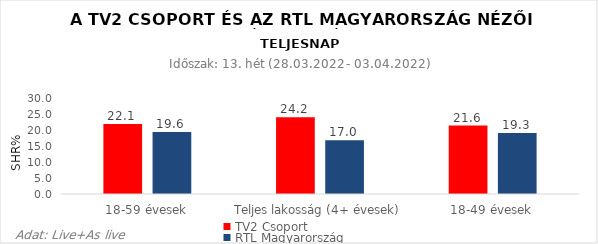
| Category | TV2 Csoport | RTL Magyarország |
|---|---|---|
| 18-59 évesek | 22.1 | 19.6 |
| Teljes lakosság (4+ évesek) | 24.2 | 17 |
| 18-49 évesek | 21.6 | 19.3 |